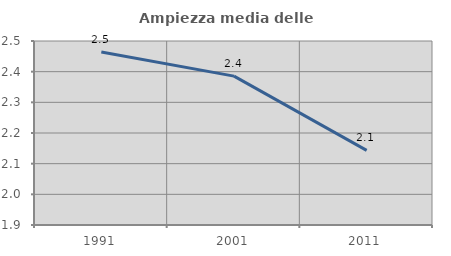
| Category | Ampiezza media delle famiglie |
|---|---|
| 1991.0 | 2.464 |
| 2001.0 | 2.385 |
| 2011.0 | 2.143 |